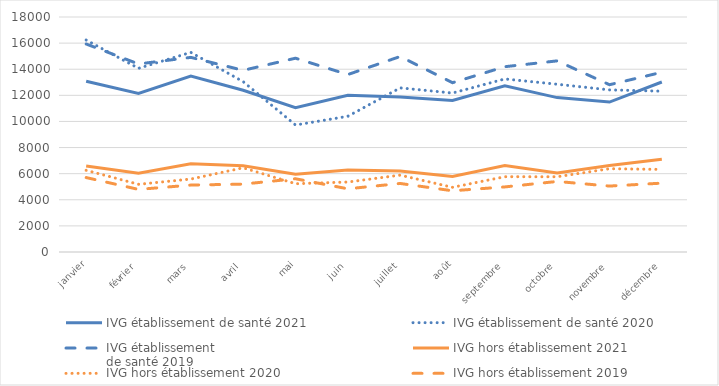
| Category | IVG établissement de santé 2021 | IVG établissement de santé 2020 | IVG établissement 
de santé 2019 | IVG hors établissement 2021 | IVG hors établissement 2020 | IVG hors établissement 2019 |
|---|---|---|---|---|---|---|
| janvier | 13076 | 16234 | 15933 | 6589 | 6258 | 5702 |
| février | 12148 | 14068 | 14402 | 6028 | 5185 | 4794 |
| mars | 13469 | 15290 | 14907 | 6753 | 5588 | 5126 |
| avril | 12389 | 13047 | 13915 | 6601 | 6447 | 5201 |
| mai | 11046 | 9727 | 14844 | 5958 | 5231 | 5610 |
| juin | 11999 | 10395 | 13592 | 6286 | 5359 | 4841 |
| juillet | 11877 | 12572 | 14973 | 6208 | 5887 | 5250 |
| août | 11611 | 12175 | 12967 | 5782 | 4953 | 4689 |
| septembre | 12730 | 13254 | 14193 | 6620 | 5767 | 4985 |
| octobre | 11825 | 12849 | 14639 | 6055 | 5764 | 5404 |
| novembre | 11482 | 12417 | 12812 | 6626 | 6380 | 5050 |
| décembre | 13021 | 12318 | 13766 | 7103 | 6326 | 5275 |